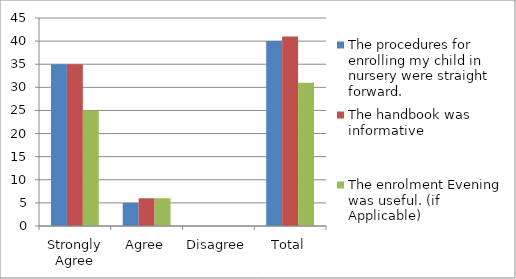
| Category | The procedures for enrolling my child in nursery were straight forward. | The handbook was informative | The enrolment Evening was useful. (if Applicable) |
|---|---|---|---|
| Strongly Agree | 35 | 35 | 25 |
| Agree | 5 | 6 | 6 |
| Disagree | 0 | 0 | 0 |
| Total | 40 | 41 | 31 |